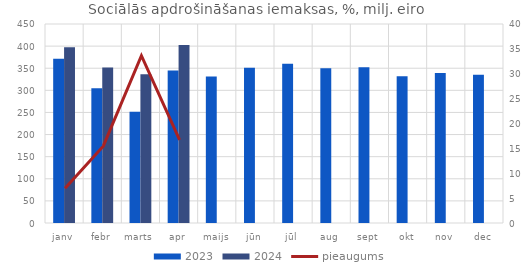
| Category | 2023 | 2024 |
|---|---|---|
| janv | 371.697 | 397.664 |
| febr | 304.659 | 351.713 |
| marts | 251.649 | 336.269 |
| apr | 344.906 | 402.61 |
| maijs | 331.367 | 0 |
| jūn | 350.907 | 0 |
| jūl | 360.075 | 0 |
| aug | 349.945 | 0 |
| sept | 352.283 | 0 |
| okt | 331.699 | 0 |
| nov | 339.067 | 0 |
| dec | 335.273 | 0 |